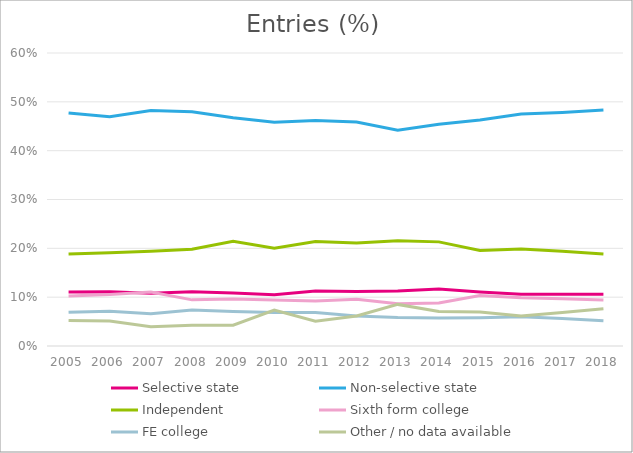
| Category | Selective state | Non-selective state | Independent | Sixth form college | FE college | Other / no data available |
|---|---|---|---|---|---|---|
| 2005.0 | 0.111 | 0.477 | 0.189 | 0.102 | 0.069 | 0.052 |
| 2006.0 | 0.111 | 0.47 | 0.191 | 0.106 | 0.071 | 0.051 |
| 2007.0 | 0.108 | 0.482 | 0.194 | 0.11 | 0.066 | 0.039 |
| 2008.0 | 0.111 | 0.48 | 0.198 | 0.094 | 0.074 | 0.043 |
| 2009.0 | 0.109 | 0.467 | 0.215 | 0.096 | 0.071 | 0.043 |
| 2010.0 | 0.105 | 0.458 | 0.2 | 0.094 | 0.069 | 0.073 |
| 2011.0 | 0.113 | 0.462 | 0.214 | 0.092 | 0.069 | 0.051 |
| 2012.0 | 0.112 | 0.459 | 0.211 | 0.096 | 0.061 | 0.062 |
| 2013.0 | 0.113 | 0.442 | 0.215 | 0.086 | 0.058 | 0.085 |
| 2014.0 | 0.117 | 0.454 | 0.213 | 0.088 | 0.057 | 0.071 |
| 2015.0 | 0.11 | 0.463 | 0.195 | 0.103 | 0.058 | 0.07 |
| 2016.0 | 0.106 | 0.475 | 0.199 | 0.099 | 0.06 | 0.061 |
| 2017.0 | 0.106 | 0.478 | 0.194 | 0.097 | 0.056 | 0.069 |
| 2018.0 | 0.106 | 0.483 | 0.189 | 0.094 | 0.051 | 0.076 |